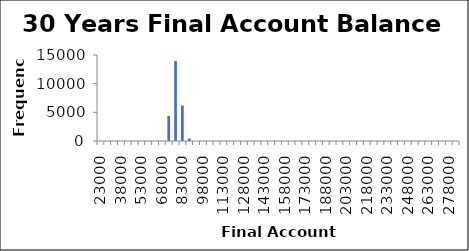
| Category | Frequency |
|---|---|
| 23000.0 | 0 |
| 28000.0 | 0 |
| 33000.0 | 0 |
| 38000.0 | 0 |
| 43000.0 | 0 |
| 48000.0 | 0 |
| 53000.0 | 0 |
| 58000.0 | 0 |
| 63000.0 | 0 |
| 68000.0 | 64 |
| 73000.0 | 4371 |
| 78000.0 | 13952 |
| 83000.0 | 6177 |
| 88000.0 | 434 |
| 93000.0 | 2 |
| 98000.0 | 0 |
| 103000.0 | 0 |
| 108000.0 | 0 |
| 113000.0 | 0 |
| 118000.0 | 0 |
| 123000.0 | 0 |
| 128000.0 | 0 |
| 133000.0 | 0 |
| 138000.0 | 0 |
| 143000.0 | 0 |
| 148000.0 | 0 |
| 153000.0 | 0 |
| 158000.0 | 0 |
| 163000.0 | 0 |
| 168000.0 | 0 |
| 173000.0 | 0 |
| 178000.0 | 0 |
| 183000.0 | 0 |
| 188000.0 | 0 |
| 193000.0 | 0 |
| 198000.0 | 0 |
| 203000.0 | 0 |
| 208000.0 | 0 |
| 213000.0 | 0 |
| 218000.0 | 0 |
| 223000.0 | 0 |
| 228000.0 | 0 |
| 233000.0 | 0 |
| 238000.0 | 0 |
| 243000.0 | 0 |
| 248000.0 | 0 |
| 253000.0 | 0 |
| 258000.0 | 0 |
| 263000.0 | 0 |
| 268000.0 | 0 |
| 273000.0 | 0 |
| 278000.0 | 0 |
| More | 0 |